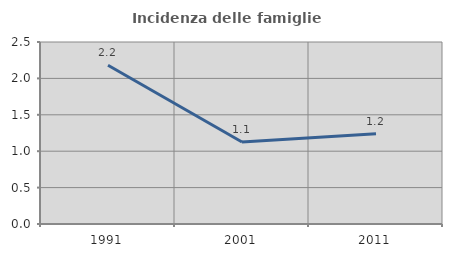
| Category | Incidenza delle famiglie numerose |
|---|---|
| 1991.0 | 2.18 |
| 2001.0 | 1.127 |
| 2011.0 | 1.238 |